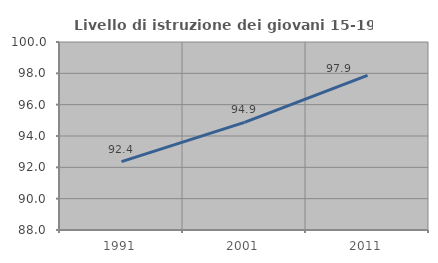
| Category | Livello di istruzione dei giovani 15-19 anni |
|---|---|
| 1991.0 | 92.361 |
| 2001.0 | 94.872 |
| 2011.0 | 97.872 |